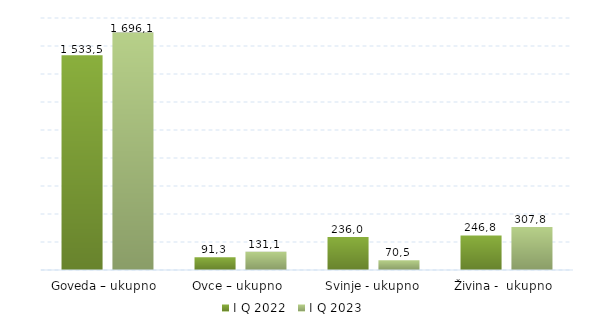
| Category | I Q 2022 | I Q 2023 |
|---|---|---|
| Goveda – ukupno  | 1533.5 | 1696.1 |
| Ovce – ukupno  | 91.3 | 131.1 |
| Svinje - ukupno | 236 | 70.5 |
| Živina -  ukupno  | 246.8 | 307.8 |